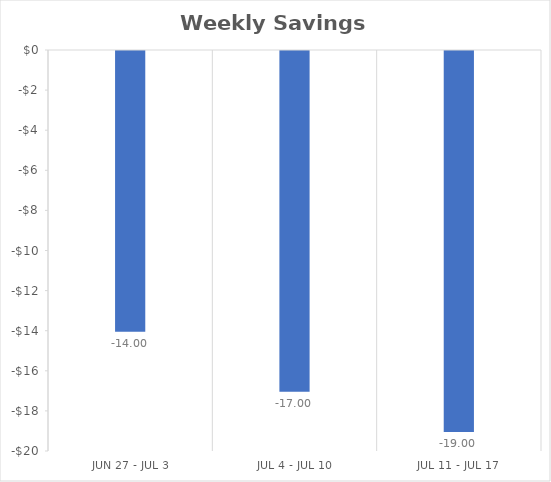
| Category | Weekly Savings (lb) |
|---|---|
| Jun 27 - Jul 3 | -14 |
| Jul 4 - Jul 10 | -17 |
| Jul 11 - Jul 17 | -19 |